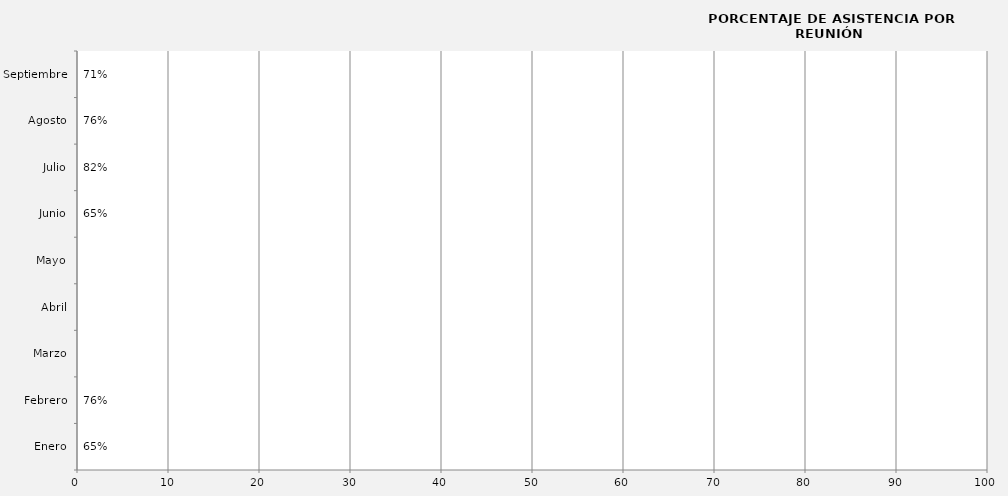
| Category | Series 0 |
|---|---|
| Enero | 0 |
| Febrero | 0 |
| Marzo | 0 |
| Abril | 0 |
| Mayo | 0 |
| Junio | 0 |
| Julio | 0 |
| Agosto | 0 |
| Septiembre | 0 |